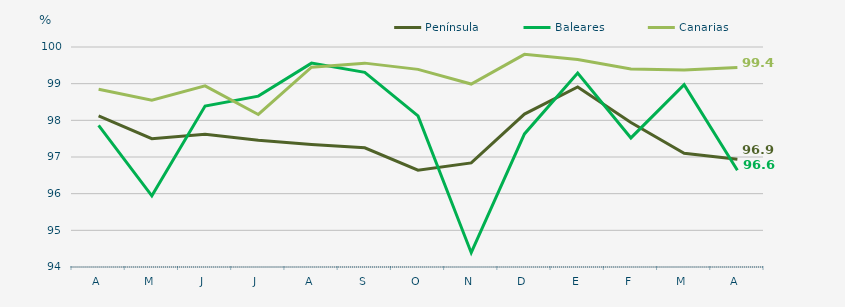
| Category | Península | Baleares | Canarias |
|---|---|---|---|
| A | 98.12 | 97.86 | 98.85 |
| M | 97.5 | 95.94 | 98.55 |
| J | 97.62 | 98.39 | 98.94 |
| J | 97.46 | 98.66 | 98.16 |
| A | 97.34 | 99.56 | 99.45 |
| S | 97.25 | 99.31 | 99.56 |
| O | 96.64 | 98.12 | 99.39 |
| N | 96.84 | 94.39 | 98.99 |
| D | 98.17 | 97.63 | 99.8 |
| E | 98.91 | 99.29 | 99.66 |
| F | 97.94 | 97.52 | 99.4 |
| M | 97.1 | 98.97 | 99.37 |
| A | 96.94 | 96.64 | 99.44 |